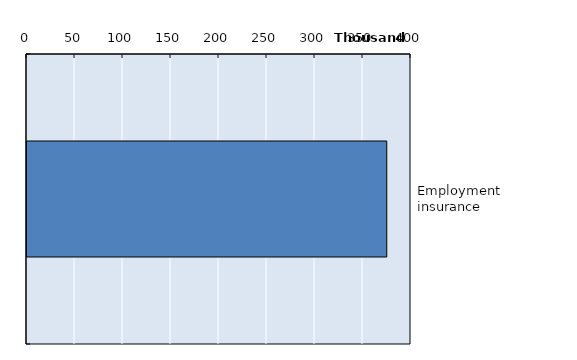
| Category | Series 0 |
|---|---|
| Employment insurance  | 374762 |